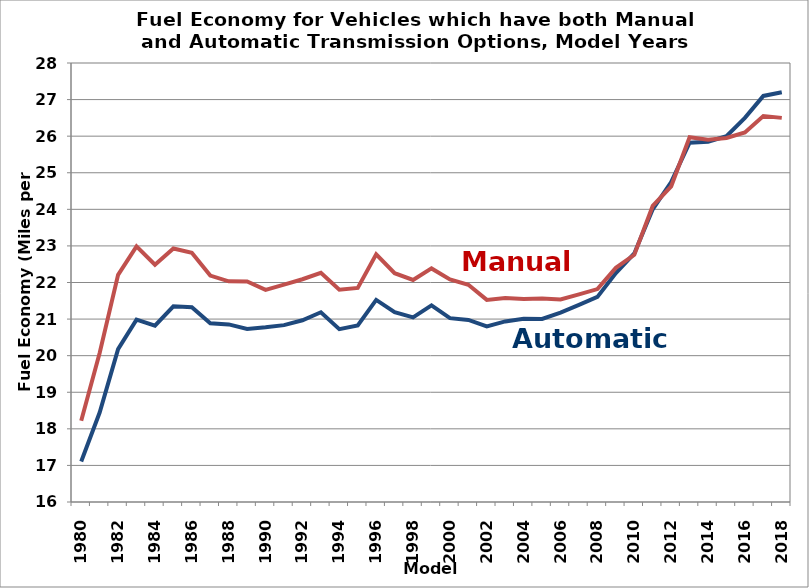
| Category | Automatic | Manual |
|---|---|---|
| 1980.0 | 17.106 | 18.22 |
| 1981.0 | 18.446 | 20.071 |
| 1982.0 | 20.18 | 22.209 |
| 1983.0 | 20.984 | 22.989 |
| 1984.0 | 20.822 | 22.487 |
| 1985.0 | 21.349 | 22.929 |
| 1986.0 | 21.323 | 22.815 |
| 1987.0 | 20.887 | 22.189 |
| 1988.0 | 20.854 | 22.031 |
| 1989.0 | 20.727 | 22.028 |
| 1990.0 | 20.774 | 21.798 |
| 1991.0 | 20.834 | 21.942 |
| 1992.0 | 20.969 | 22.089 |
| 1993.0 | 21.186 | 22.265 |
| 1994.0 | 20.723 | 21.802 |
| 1995.0 | 20.828 | 21.851 |
| 1996.0 | 21.525 | 22.769 |
| 1997.0 | 21.189 | 22.255 |
| 1998.0 | 21.048 | 22.07 |
| 1999.0 | 21.375 | 22.385 |
| 2000.0 | 21.026 | 22.083 |
| 2001.0 | 20.978 | 21.939 |
| 2002.0 | 20.801 | 21.525 |
| 2003.0 | 20.937 | 21.575 |
| 2004.0 | 21.01 | 21.551 |
| 2005.0 | 21.003 | 21.559 |
| 2006.0 | 21.178 | 21.534 |
| 2007.0 | 21.388 | 21.674 |
| 2008.0 | 21.606 | 21.821 |
| 2009.0 | 22.257 | 22.4 |
| 2010.0 | 22.793 | 22.757 |
| 2011.0 | 24 | 24.093 |
| 2012.0 | 24.746 | 24.629 |
| 2013.0 | 25.821 | 25.97 |
| 2014.0 | 25.85 | 25.9 |
| 2015.0 | 26 | 25.95 |
| 2016.0 | 26.5 | 26.1 |
| 2017.0 | 27.1 | 26.55 |
| 2018.0 | 27.2 | 26.5 |